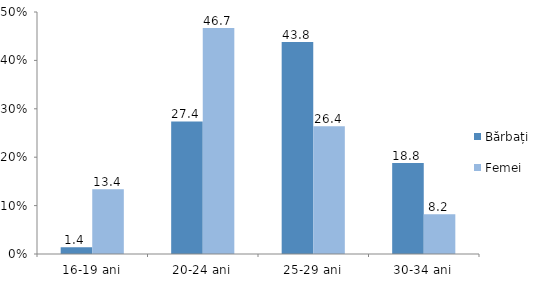
| Category | Bărbați | Femei |
|---|---|---|
| 16-19 ani | 1.4 | 13.4 |
| 20-24 ani | 27.4 | 46.7 |
| 25-29 ani | 43.8 | 26.4 |
| 30-34 ani | 18.8 | 8.2 |